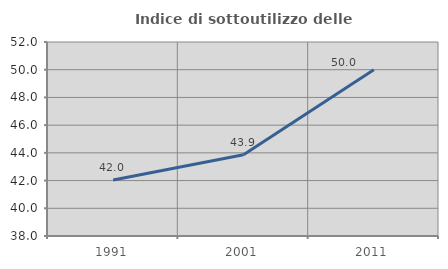
| Category | Indice di sottoutilizzo delle abitazioni  |
|---|---|
| 1991.0 | 42.038 |
| 2001.0 | 43.86 |
| 2011.0 | 50 |